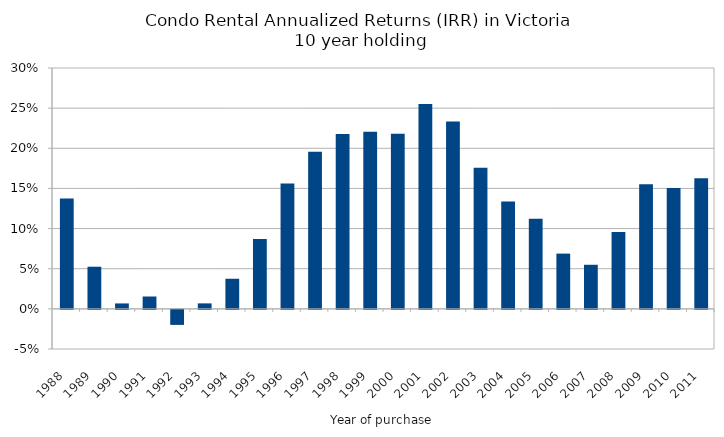
| Category | IRR (10 year) |
|---|---|
| 1988-01-01 | 0.137 |
| 1989-01-01 | 0.052 |
| 1990-01-01 | 0.007 |
| 1991-01-01 | 0.015 |
| 1992-01-01 | -0.019 |
| 1993-01-01 | 0.007 |
| 1994-01-01 | 0.037 |
| 1995-01-01 | 0.087 |
| 1996-01-01 | 0.156 |
| 1997-01-01 | 0.196 |
| 1998-01-01 | 0.218 |
| 1999-01-01 | 0.221 |
| 2000-01-01 | 0.218 |
| 2001-01-01 | 0.255 |
| 2002-01-01 | 0.233 |
| 2003-01-01 | 0.176 |
| 2004-01-01 | 0.134 |
| 2005-01-01 | 0.112 |
| 2006-01-01 | 0.069 |
| 2007-01-01 | 0.055 |
| 2008-01-01 | 0.096 |
| 2009-01-01 | 0.155 |
| 2010-01-01 | 0.151 |
| 2011-01-01 | 0.163 |